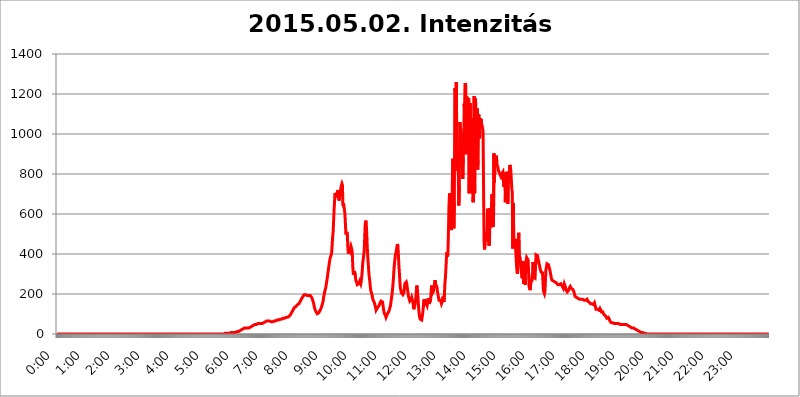
| Category | 2015.05.02. Intenzitás [W/m^2] |
|---|---|
| 0.0 | 0 |
| 0.0006944444444444445 | 0 |
| 0.001388888888888889 | 0 |
| 0.0020833333333333333 | 0 |
| 0.002777777777777778 | 0 |
| 0.003472222222222222 | 0 |
| 0.004166666666666667 | 0 |
| 0.004861111111111111 | 0 |
| 0.005555555555555556 | 0 |
| 0.0062499999999999995 | 0 |
| 0.006944444444444444 | 0 |
| 0.007638888888888889 | 0 |
| 0.008333333333333333 | 0 |
| 0.009027777777777779 | 0 |
| 0.009722222222222222 | 0 |
| 0.010416666666666666 | 0 |
| 0.011111111111111112 | 0 |
| 0.011805555555555555 | 0 |
| 0.012499999999999999 | 0 |
| 0.013194444444444444 | 0 |
| 0.013888888888888888 | 0 |
| 0.014583333333333332 | 0 |
| 0.015277777777777777 | 0 |
| 0.015972222222222224 | 0 |
| 0.016666666666666666 | 0 |
| 0.017361111111111112 | 0 |
| 0.018055555555555557 | 0 |
| 0.01875 | 0 |
| 0.019444444444444445 | 0 |
| 0.02013888888888889 | 0 |
| 0.020833333333333332 | 0 |
| 0.02152777777777778 | 0 |
| 0.022222222222222223 | 0 |
| 0.02291666666666667 | 0 |
| 0.02361111111111111 | 0 |
| 0.024305555555555556 | 0 |
| 0.024999999999999998 | 0 |
| 0.025694444444444447 | 0 |
| 0.02638888888888889 | 0 |
| 0.027083333333333334 | 0 |
| 0.027777777777777776 | 0 |
| 0.02847222222222222 | 0 |
| 0.029166666666666664 | 0 |
| 0.029861111111111113 | 0 |
| 0.030555555555555555 | 0 |
| 0.03125 | 0 |
| 0.03194444444444445 | 0 |
| 0.03263888888888889 | 0 |
| 0.03333333333333333 | 0 |
| 0.034027777777777775 | 0 |
| 0.034722222222222224 | 0 |
| 0.035416666666666666 | 0 |
| 0.036111111111111115 | 0 |
| 0.03680555555555556 | 0 |
| 0.0375 | 0 |
| 0.03819444444444444 | 0 |
| 0.03888888888888889 | 0 |
| 0.03958333333333333 | 0 |
| 0.04027777777777778 | 0 |
| 0.04097222222222222 | 0 |
| 0.041666666666666664 | 0 |
| 0.042361111111111106 | 0 |
| 0.04305555555555556 | 0 |
| 0.043750000000000004 | 0 |
| 0.044444444444444446 | 0 |
| 0.04513888888888889 | 0 |
| 0.04583333333333334 | 0 |
| 0.04652777777777778 | 0 |
| 0.04722222222222222 | 0 |
| 0.04791666666666666 | 0 |
| 0.04861111111111111 | 0 |
| 0.049305555555555554 | 0 |
| 0.049999999999999996 | 0 |
| 0.05069444444444445 | 0 |
| 0.051388888888888894 | 0 |
| 0.052083333333333336 | 0 |
| 0.05277777777777778 | 0 |
| 0.05347222222222222 | 0 |
| 0.05416666666666667 | 0 |
| 0.05486111111111111 | 0 |
| 0.05555555555555555 | 0 |
| 0.05625 | 0 |
| 0.05694444444444444 | 0 |
| 0.057638888888888885 | 0 |
| 0.05833333333333333 | 0 |
| 0.05902777777777778 | 0 |
| 0.059722222222222225 | 0 |
| 0.06041666666666667 | 0 |
| 0.061111111111111116 | 0 |
| 0.06180555555555556 | 0 |
| 0.0625 | 0 |
| 0.06319444444444444 | 0 |
| 0.06388888888888888 | 0 |
| 0.06458333333333334 | 0 |
| 0.06527777777777778 | 0 |
| 0.06597222222222222 | 0 |
| 0.06666666666666667 | 0 |
| 0.06736111111111111 | 0 |
| 0.06805555555555555 | 0 |
| 0.06874999999999999 | 0 |
| 0.06944444444444443 | 0 |
| 0.07013888888888889 | 0 |
| 0.07083333333333333 | 0 |
| 0.07152777777777779 | 0 |
| 0.07222222222222223 | 0 |
| 0.07291666666666667 | 0 |
| 0.07361111111111111 | 0 |
| 0.07430555555555556 | 0 |
| 0.075 | 0 |
| 0.07569444444444444 | 0 |
| 0.0763888888888889 | 0 |
| 0.07708333333333334 | 0 |
| 0.07777777777777778 | 0 |
| 0.07847222222222222 | 0 |
| 0.07916666666666666 | 0 |
| 0.0798611111111111 | 0 |
| 0.08055555555555556 | 0 |
| 0.08125 | 0 |
| 0.08194444444444444 | 0 |
| 0.08263888888888889 | 0 |
| 0.08333333333333333 | 0 |
| 0.08402777777777777 | 0 |
| 0.08472222222222221 | 0 |
| 0.08541666666666665 | 0 |
| 0.08611111111111112 | 0 |
| 0.08680555555555557 | 0 |
| 0.08750000000000001 | 0 |
| 0.08819444444444445 | 0 |
| 0.08888888888888889 | 0 |
| 0.08958333333333333 | 0 |
| 0.09027777777777778 | 0 |
| 0.09097222222222222 | 0 |
| 0.09166666666666667 | 0 |
| 0.09236111111111112 | 0 |
| 0.09305555555555556 | 0 |
| 0.09375 | 0 |
| 0.09444444444444444 | 0 |
| 0.09513888888888888 | 0 |
| 0.09583333333333333 | 0 |
| 0.09652777777777777 | 0 |
| 0.09722222222222222 | 0 |
| 0.09791666666666667 | 0 |
| 0.09861111111111111 | 0 |
| 0.09930555555555555 | 0 |
| 0.09999999999999999 | 0 |
| 0.10069444444444443 | 0 |
| 0.1013888888888889 | 0 |
| 0.10208333333333335 | 0 |
| 0.10277777777777779 | 0 |
| 0.10347222222222223 | 0 |
| 0.10416666666666667 | 0 |
| 0.10486111111111111 | 0 |
| 0.10555555555555556 | 0 |
| 0.10625 | 0 |
| 0.10694444444444444 | 0 |
| 0.1076388888888889 | 0 |
| 0.10833333333333334 | 0 |
| 0.10902777777777778 | 0 |
| 0.10972222222222222 | 0 |
| 0.1111111111111111 | 0 |
| 0.11180555555555556 | 0 |
| 0.11180555555555556 | 0 |
| 0.1125 | 0 |
| 0.11319444444444444 | 0 |
| 0.11388888888888889 | 0 |
| 0.11458333333333333 | 0 |
| 0.11527777777777777 | 0 |
| 0.11597222222222221 | 0 |
| 0.11666666666666665 | 0 |
| 0.1173611111111111 | 0 |
| 0.11805555555555557 | 0 |
| 0.11944444444444445 | 0 |
| 0.12013888888888889 | 0 |
| 0.12083333333333333 | 0 |
| 0.12152777777777778 | 0 |
| 0.12222222222222223 | 0 |
| 0.12291666666666667 | 0 |
| 0.12291666666666667 | 0 |
| 0.12361111111111112 | 0 |
| 0.12430555555555556 | 0 |
| 0.125 | 0 |
| 0.12569444444444444 | 0 |
| 0.12638888888888888 | 0 |
| 0.12708333333333333 | 0 |
| 0.16875 | 0 |
| 0.12847222222222224 | 0 |
| 0.12916666666666668 | 0 |
| 0.12986111111111112 | 0 |
| 0.13055555555555556 | 0 |
| 0.13125 | 0 |
| 0.13194444444444445 | 0 |
| 0.1326388888888889 | 0 |
| 0.13333333333333333 | 0 |
| 0.13402777777777777 | 0 |
| 0.13402777777777777 | 0 |
| 0.13472222222222222 | 0 |
| 0.13541666666666666 | 0 |
| 0.1361111111111111 | 0 |
| 0.13749999999999998 | 0 |
| 0.13819444444444443 | 0 |
| 0.1388888888888889 | 0 |
| 0.13958333333333334 | 0 |
| 0.14027777777777778 | 0 |
| 0.14097222222222222 | 0 |
| 0.14166666666666666 | 0 |
| 0.1423611111111111 | 0 |
| 0.14305555555555557 | 0 |
| 0.14375000000000002 | 0 |
| 0.14444444444444446 | 0 |
| 0.1451388888888889 | 0 |
| 0.1451388888888889 | 0 |
| 0.14652777777777778 | 0 |
| 0.14722222222222223 | 0 |
| 0.14791666666666667 | 0 |
| 0.1486111111111111 | 0 |
| 0.14930555555555555 | 0 |
| 0.15 | 0 |
| 0.15069444444444444 | 0 |
| 0.15138888888888888 | 0 |
| 0.15208333333333332 | 0 |
| 0.15277777777777776 | 0 |
| 0.15347222222222223 | 0 |
| 0.15416666666666667 | 0 |
| 0.15486111111111112 | 0 |
| 0.15555555555555556 | 0 |
| 0.15625 | 0 |
| 0.15694444444444444 | 0 |
| 0.15763888888888888 | 0 |
| 0.15833333333333333 | 0 |
| 0.15902777777777777 | 0 |
| 0.15972222222222224 | 0 |
| 0.16041666666666668 | 0 |
| 0.16111111111111112 | 0 |
| 0.16180555555555556 | 0 |
| 0.1625 | 0 |
| 0.16319444444444445 | 0 |
| 0.1638888888888889 | 0 |
| 0.16458333333333333 | 0 |
| 0.16527777777777777 | 0 |
| 0.16597222222222222 | 0 |
| 0.16666666666666666 | 0 |
| 0.1673611111111111 | 0 |
| 0.16805555555555554 | 0 |
| 0.16874999999999998 | 0 |
| 0.16944444444444443 | 0 |
| 0.17013888888888887 | 0 |
| 0.1708333333333333 | 0 |
| 0.17152777777777775 | 0 |
| 0.17222222222222225 | 0 |
| 0.1729166666666667 | 0 |
| 0.17361111111111113 | 0 |
| 0.17430555555555557 | 0 |
| 0.17500000000000002 | 0 |
| 0.17569444444444446 | 0 |
| 0.1763888888888889 | 0 |
| 0.17708333333333334 | 0 |
| 0.17777777777777778 | 0 |
| 0.17847222222222223 | 0 |
| 0.17916666666666667 | 0 |
| 0.1798611111111111 | 0 |
| 0.18055555555555555 | 0 |
| 0.18125 | 0 |
| 0.18194444444444444 | 0 |
| 0.1826388888888889 | 0 |
| 0.18333333333333335 | 0 |
| 0.1840277777777778 | 0 |
| 0.18472222222222223 | 0 |
| 0.18541666666666667 | 0 |
| 0.18611111111111112 | 0 |
| 0.18680555555555556 | 0 |
| 0.1875 | 0 |
| 0.18819444444444444 | 0 |
| 0.18888888888888888 | 0 |
| 0.18958333333333333 | 0 |
| 0.19027777777777777 | 0 |
| 0.1909722222222222 | 0 |
| 0.19166666666666665 | 0 |
| 0.19236111111111112 | 0 |
| 0.19305555555555554 | 0 |
| 0.19375 | 0 |
| 0.19444444444444445 | 0 |
| 0.1951388888888889 | 0 |
| 0.19583333333333333 | 0 |
| 0.19652777777777777 | 0 |
| 0.19722222222222222 | 0 |
| 0.19791666666666666 | 0 |
| 0.1986111111111111 | 0 |
| 0.19930555555555554 | 0 |
| 0.19999999999999998 | 0 |
| 0.20069444444444443 | 0 |
| 0.20138888888888887 | 0 |
| 0.2020833333333333 | 0 |
| 0.2027777777777778 | 0 |
| 0.2034722222222222 | 0 |
| 0.2041666666666667 | 0 |
| 0.20486111111111113 | 0 |
| 0.20555555555555557 | 0 |
| 0.20625000000000002 | 0 |
| 0.20694444444444446 | 0 |
| 0.2076388888888889 | 0 |
| 0.20833333333333334 | 0 |
| 0.20902777777777778 | 0 |
| 0.20972222222222223 | 0 |
| 0.21041666666666667 | 0 |
| 0.2111111111111111 | 0 |
| 0.21180555555555555 | 0 |
| 0.2125 | 0 |
| 0.21319444444444444 | 0 |
| 0.2138888888888889 | 0 |
| 0.21458333333333335 | 0 |
| 0.2152777777777778 | 0 |
| 0.21597222222222223 | 0 |
| 0.21666666666666667 | 0 |
| 0.21736111111111112 | 0 |
| 0.21805555555555556 | 0 |
| 0.21875 | 0 |
| 0.21944444444444444 | 0 |
| 0.22013888888888888 | 0 |
| 0.22083333333333333 | 0 |
| 0.22152777777777777 | 0 |
| 0.2222222222222222 | 0 |
| 0.22291666666666665 | 0 |
| 0.2236111111111111 | 0 |
| 0.22430555555555556 | 0 |
| 0.225 | 0 |
| 0.22569444444444445 | 0 |
| 0.2263888888888889 | 0 |
| 0.22708333333333333 | 0 |
| 0.22777777777777777 | 0 |
| 0.22847222222222222 | 0 |
| 0.22916666666666666 | 0 |
| 0.2298611111111111 | 0 |
| 0.23055555555555554 | 0 |
| 0.23124999999999998 | 0 |
| 0.23194444444444443 | 0 |
| 0.23263888888888887 | 0 |
| 0.2333333333333333 | 0 |
| 0.2340277777777778 | 0 |
| 0.2347222222222222 | 0 |
| 0.2354166666666667 | 3.525 |
| 0.23611111111111113 | 0 |
| 0.23680555555555557 | 3.525 |
| 0.23750000000000002 | 3.525 |
| 0.23819444444444446 | 3.525 |
| 0.2388888888888889 | 3.525 |
| 0.23958333333333334 | 3.525 |
| 0.24027777777777778 | 3.525 |
| 0.24097222222222223 | 3.525 |
| 0.24166666666666667 | 3.525 |
| 0.2423611111111111 | 3.525 |
| 0.24305555555555555 | 3.525 |
| 0.24375 | 7.887 |
| 0.24444444444444446 | 7.887 |
| 0.24513888888888888 | 7.887 |
| 0.24583333333333335 | 7.887 |
| 0.2465277777777778 | 3.525 |
| 0.24722222222222223 | 7.887 |
| 0.24791666666666667 | 7.887 |
| 0.24861111111111112 | 7.887 |
| 0.24930555555555556 | 7.887 |
| 0.25 | 7.887 |
| 0.25069444444444444 | 7.887 |
| 0.2513888888888889 | 12.257 |
| 0.2520833333333333 | 12.257 |
| 0.25277777777777777 | 12.257 |
| 0.2534722222222222 | 12.257 |
| 0.25416666666666665 | 12.257 |
| 0.2548611111111111 | 12.257 |
| 0.2555555555555556 | 16.636 |
| 0.25625000000000003 | 16.636 |
| 0.2569444444444445 | 16.636 |
| 0.2576388888888889 | 21.024 |
| 0.25833333333333336 | 21.024 |
| 0.2590277777777778 | 21.024 |
| 0.25972222222222224 | 25.419 |
| 0.2604166666666667 | 25.419 |
| 0.2611111111111111 | 25.419 |
| 0.26180555555555557 | 29.823 |
| 0.2625 | 29.823 |
| 0.26319444444444445 | 29.823 |
| 0.2638888888888889 | 29.823 |
| 0.26458333333333334 | 29.823 |
| 0.2652777777777778 | 29.823 |
| 0.2659722222222222 | 29.823 |
| 0.26666666666666666 | 29.823 |
| 0.2673611111111111 | 29.823 |
| 0.26805555555555555 | 29.823 |
| 0.26875 | 29.823 |
| 0.26944444444444443 | 29.823 |
| 0.2701388888888889 | 29.823 |
| 0.2708333333333333 | 34.234 |
| 0.27152777777777776 | 34.234 |
| 0.2722222222222222 | 38.653 |
| 0.27291666666666664 | 38.653 |
| 0.2736111111111111 | 43.079 |
| 0.2743055555555555 | 43.079 |
| 0.27499999999999997 | 43.079 |
| 0.27569444444444446 | 47.511 |
| 0.27638888888888885 | 47.511 |
| 0.27708333333333335 | 47.511 |
| 0.2777777777777778 | 47.511 |
| 0.27847222222222223 | 47.511 |
| 0.2791666666666667 | 47.511 |
| 0.2798611111111111 | 47.511 |
| 0.28055555555555556 | 51.951 |
| 0.28125 | 51.951 |
| 0.28194444444444444 | 51.951 |
| 0.2826388888888889 | 51.951 |
| 0.2833333333333333 | 51.951 |
| 0.28402777777777777 | 51.951 |
| 0.2847222222222222 | 51.951 |
| 0.28541666666666665 | 51.951 |
| 0.28611111111111115 | 51.951 |
| 0.28680555555555554 | 51.951 |
| 0.28750000000000003 | 51.951 |
| 0.2881944444444445 | 56.398 |
| 0.2888888888888889 | 56.398 |
| 0.28958333333333336 | 56.398 |
| 0.2902777777777778 | 60.85 |
| 0.29097222222222224 | 60.85 |
| 0.2916666666666667 | 60.85 |
| 0.2923611111111111 | 65.31 |
| 0.29305555555555557 | 65.31 |
| 0.29375 | 65.31 |
| 0.29444444444444445 | 65.31 |
| 0.2951388888888889 | 65.31 |
| 0.29583333333333334 | 65.31 |
| 0.2965277777777778 | 65.31 |
| 0.2972222222222222 | 65.31 |
| 0.29791666666666666 | 65.31 |
| 0.2986111111111111 | 65.31 |
| 0.29930555555555555 | 65.31 |
| 0.3 | 60.85 |
| 0.30069444444444443 | 60.85 |
| 0.3013888888888889 | 60.85 |
| 0.3020833333333333 | 60.85 |
| 0.30277777777777776 | 60.85 |
| 0.3034722222222222 | 65.31 |
| 0.30416666666666664 | 65.31 |
| 0.3048611111111111 | 65.31 |
| 0.3055555555555555 | 65.31 |
| 0.30624999999999997 | 65.31 |
| 0.3069444444444444 | 69.775 |
| 0.3076388888888889 | 69.775 |
| 0.30833333333333335 | 69.775 |
| 0.3090277777777778 | 69.775 |
| 0.30972222222222223 | 69.775 |
| 0.3104166666666667 | 69.775 |
| 0.3111111111111111 | 69.775 |
| 0.31180555555555556 | 69.775 |
| 0.3125 | 74.246 |
| 0.31319444444444444 | 74.246 |
| 0.3138888888888889 | 74.246 |
| 0.3145833333333333 | 74.246 |
| 0.31527777777777777 | 74.246 |
| 0.3159722222222222 | 74.246 |
| 0.31666666666666665 | 78.722 |
| 0.31736111111111115 | 78.722 |
| 0.31805555555555554 | 78.722 |
| 0.31875000000000003 | 78.722 |
| 0.3194444444444445 | 83.205 |
| 0.3201388888888889 | 83.205 |
| 0.32083333333333336 | 83.205 |
| 0.3215277777777778 | 83.205 |
| 0.32222222222222224 | 83.205 |
| 0.3229166666666667 | 83.205 |
| 0.3236111111111111 | 83.205 |
| 0.32430555555555557 | 83.205 |
| 0.325 | 87.692 |
| 0.32569444444444445 | 87.692 |
| 0.3263888888888889 | 92.184 |
| 0.32708333333333334 | 96.682 |
| 0.3277777777777778 | 101.184 |
| 0.3284722222222222 | 105.69 |
| 0.32916666666666666 | 110.201 |
| 0.3298611111111111 | 114.716 |
| 0.33055555555555555 | 119.235 |
| 0.33125 | 123.758 |
| 0.33194444444444443 | 128.284 |
| 0.3326388888888889 | 132.814 |
| 0.3333333333333333 | 132.814 |
| 0.3340277777777778 | 137.347 |
| 0.3347222222222222 | 137.347 |
| 0.3354166666666667 | 141.884 |
| 0.3361111111111111 | 141.884 |
| 0.3368055555555556 | 146.423 |
| 0.33749999999999997 | 146.423 |
| 0.33819444444444446 | 150.964 |
| 0.33888888888888885 | 150.964 |
| 0.33958333333333335 | 155.509 |
| 0.34027777777777773 | 160.056 |
| 0.34097222222222223 | 164.605 |
| 0.3416666666666666 | 169.156 |
| 0.3423611111111111 | 173.709 |
| 0.3430555555555555 | 178.264 |
| 0.34375 | 182.82 |
| 0.3444444444444445 | 187.378 |
| 0.3451388888888889 | 191.937 |
| 0.3458333333333334 | 191.937 |
| 0.34652777777777777 | 196.497 |
| 0.34722222222222227 | 196.497 |
| 0.34791666666666665 | 191.937 |
| 0.34861111111111115 | 196.497 |
| 0.34930555555555554 | 196.497 |
| 0.35000000000000003 | 196.497 |
| 0.3506944444444444 | 191.937 |
| 0.3513888888888889 | 191.937 |
| 0.3520833333333333 | 191.937 |
| 0.3527777777777778 | 191.937 |
| 0.3534722222222222 | 191.937 |
| 0.3541666666666667 | 191.937 |
| 0.3548611111111111 | 191.937 |
| 0.35555555555555557 | 191.937 |
| 0.35625 | 191.937 |
| 0.35694444444444445 | 182.82 |
| 0.3576388888888889 | 178.264 |
| 0.35833333333333334 | 169.156 |
| 0.3590277777777778 | 160.056 |
| 0.3597222222222222 | 150.964 |
| 0.36041666666666666 | 137.347 |
| 0.3611111111111111 | 128.284 |
| 0.36180555555555555 | 119.235 |
| 0.3625 | 114.716 |
| 0.36319444444444443 | 110.201 |
| 0.3638888888888889 | 105.69 |
| 0.3645833333333333 | 101.184 |
| 0.3652777777777778 | 101.184 |
| 0.3659722222222222 | 105.69 |
| 0.3666666666666667 | 105.69 |
| 0.3673611111111111 | 110.201 |
| 0.3680555555555556 | 114.716 |
| 0.36874999999999997 | 119.235 |
| 0.36944444444444446 | 123.758 |
| 0.37013888888888885 | 128.284 |
| 0.37083333333333335 | 137.347 |
| 0.37152777777777773 | 146.423 |
| 0.37222222222222223 | 155.509 |
| 0.3729166666666666 | 164.605 |
| 0.3736111111111111 | 182.82 |
| 0.3743055555555555 | 196.497 |
| 0.375 | 210.182 |
| 0.3756944444444445 | 219.309 |
| 0.3763888888888889 | 228.436 |
| 0.3770833333333334 | 242.127 |
| 0.37777777777777777 | 260.373 |
| 0.37847222222222227 | 274.047 |
| 0.37916666666666665 | 292.259 |
| 0.37986111111111115 | 310.44 |
| 0.38055555555555554 | 328.584 |
| 0.38125000000000003 | 346.682 |
| 0.3819444444444444 | 364.728 |
| 0.3826388888888889 | 378.224 |
| 0.3833333333333333 | 387.202 |
| 0.3840277777777778 | 387.202 |
| 0.3847222222222222 | 400.638 |
| 0.3854166666666667 | 436.27 |
| 0.3861111111111111 | 480.356 |
| 0.38680555555555557 | 502.192 |
| 0.3875 | 553.986 |
| 0.38819444444444445 | 617.436 |
| 0.3888888888888889 | 658.909 |
| 0.38958333333333334 | 703.762 |
| 0.3902777777777778 | 707.8 |
| 0.3909722222222222 | 683.473 |
| 0.39166666666666666 | 683.473 |
| 0.3923611111111111 | 687.544 |
| 0.39305555555555555 | 711.832 |
| 0.39375 | 719.877 |
| 0.39444444444444443 | 687.544 |
| 0.3951388888888889 | 667.123 |
| 0.3958333333333333 | 679.395 |
| 0.3965277777777778 | 703.762 |
| 0.3972222222222222 | 715.858 |
| 0.3979166666666667 | 731.896 |
| 0.3986111111111111 | 743.859 |
| 0.3993055555555556 | 751.803 |
| 0.39999999999999997 | 743.859 |
| 0.40069444444444446 | 642.4 |
| 0.40138888888888885 | 654.791 |
| 0.40208333333333335 | 634.105 |
| 0.40277777777777773 | 621.613 |
| 0.40347222222222223 | 600.661 |
| 0.4041666666666666 | 549.704 |
| 0.4048611111111111 | 497.836 |
| 0.4055555555555555 | 497.836 |
| 0.40625 | 510.885 |
| 0.4069444444444445 | 489.108 |
| 0.4076388888888889 | 431.833 |
| 0.4083333333333334 | 400.638 |
| 0.40902777777777777 | 422.943 |
| 0.40972222222222227 | 418.492 |
| 0.41041666666666665 | 414.035 |
| 0.41111111111111115 | 431.833 |
| 0.41180555555555554 | 440.702 |
| 0.41250000000000003 | 431.833 |
| 0.4131944444444444 | 422.943 |
| 0.4138888888888889 | 396.164 |
| 0.4145833333333333 | 333.113 |
| 0.4152777777777778 | 296.808 |
| 0.4159722222222222 | 305.898 |
| 0.4166666666666667 | 314.98 |
| 0.4173611111111111 | 314.98 |
| 0.41805555555555557 | 292.259 |
| 0.41875 | 269.49 |
| 0.41944444444444445 | 264.932 |
| 0.4201388888888889 | 255.813 |
| 0.42083333333333334 | 246.689 |
| 0.4215277777777778 | 246.689 |
| 0.4222222222222222 | 246.689 |
| 0.42291666666666666 | 251.251 |
| 0.4236111111111111 | 246.689 |
| 0.42430555555555555 | 264.932 |
| 0.425 | 260.373 |
| 0.42569444444444443 | 251.251 |
| 0.4263888888888889 | 264.932 |
| 0.4270833333333333 | 287.709 |
| 0.4277777777777778 | 314.98 |
| 0.4284722222222222 | 355.712 |
| 0.4291666666666667 | 373.729 |
| 0.4298611111111111 | 378.224 |
| 0.4305555555555556 | 418.492 |
| 0.43124999999999997 | 484.735 |
| 0.43194444444444446 | 549.704 |
| 0.43263888888888885 | 566.793 |
| 0.43333333333333335 | 553.986 |
| 0.43402777777777773 | 506.542 |
| 0.43472222222222223 | 440.702 |
| 0.4354166666666666 | 391.685 |
| 0.4361111111111111 | 355.712 |
| 0.4368055555555555 | 319.517 |
| 0.4375 | 287.709 |
| 0.4381944444444445 | 269.49 |
| 0.4388888888888889 | 242.127 |
| 0.4395833333333334 | 219.309 |
| 0.44027777777777777 | 210.182 |
| 0.44097222222222227 | 210.182 |
| 0.44166666666666665 | 191.937 |
| 0.44236111111111115 | 178.264 |
| 0.44305555555555554 | 169.156 |
| 0.44375000000000003 | 164.605 |
| 0.4444444444444444 | 160.056 |
| 0.4451388888888889 | 150.964 |
| 0.4458333333333333 | 141.884 |
| 0.4465277777777778 | 132.814 |
| 0.4472222222222222 | 119.235 |
| 0.4479166666666667 | 114.716 |
| 0.4486111111111111 | 123.758 |
| 0.44930555555555557 | 132.814 |
| 0.45 | 132.814 |
| 0.45069444444444445 | 137.347 |
| 0.4513888888888889 | 141.884 |
| 0.45208333333333334 | 146.423 |
| 0.4527777777777778 | 155.509 |
| 0.4534722222222222 | 160.056 |
| 0.45416666666666666 | 164.605 |
| 0.4548611111111111 | 164.605 |
| 0.45555555555555555 | 169.156 |
| 0.45625 | 160.056 |
| 0.45694444444444443 | 141.884 |
| 0.4576388888888889 | 123.758 |
| 0.4583333333333333 | 110.201 |
| 0.4590277777777778 | 101.184 |
| 0.4597222222222222 | 96.682 |
| 0.4604166666666667 | 92.184 |
| 0.4611111111111111 | 83.205 |
| 0.4618055555555556 | 83.205 |
| 0.46249999999999997 | 87.692 |
| 0.46319444444444446 | 101.184 |
| 0.46388888888888885 | 105.69 |
| 0.46458333333333335 | 105.69 |
| 0.46527777777777773 | 114.716 |
| 0.46597222222222223 | 123.758 |
| 0.4666666666666666 | 128.284 |
| 0.4673611111111111 | 141.884 |
| 0.4680555555555555 | 160.056 |
| 0.46875 | 178.264 |
| 0.4694444444444445 | 196.497 |
| 0.4701388888888889 | 219.309 |
| 0.4708333333333334 | 246.689 |
| 0.47152777777777777 | 278.603 |
| 0.47222222222222227 | 319.517 |
| 0.47291666666666665 | 351.198 |
| 0.47361111111111115 | 373.729 |
| 0.47430555555555554 | 396.164 |
| 0.47500000000000003 | 405.108 |
| 0.4756944444444444 | 418.492 |
| 0.4763888888888889 | 436.27 |
| 0.4770833333333333 | 449.551 |
| 0.4777777777777778 | 440.702 |
| 0.4784722222222222 | 396.164 |
| 0.4791666666666667 | 342.162 |
| 0.4798611111111111 | 305.898 |
| 0.48055555555555557 | 260.373 |
| 0.48125 | 228.436 |
| 0.48194444444444445 | 219.309 |
| 0.4826388888888889 | 205.62 |
| 0.48333333333333334 | 210.182 |
| 0.4840277777777778 | 205.62 |
| 0.4847222222222222 | 196.497 |
| 0.48541666666666666 | 201.058 |
| 0.4861111111111111 | 205.62 |
| 0.48680555555555555 | 223.873 |
| 0.4875 | 251.251 |
| 0.48819444444444443 | 251.251 |
| 0.4888888888888889 | 251.251 |
| 0.4895833333333333 | 260.373 |
| 0.4902777777777778 | 251.251 |
| 0.4909722222222222 | 228.436 |
| 0.4916666666666667 | 214.746 |
| 0.4923611111111111 | 191.937 |
| 0.4930555555555556 | 182.82 |
| 0.49374999999999997 | 173.709 |
| 0.49444444444444446 | 164.605 |
| 0.49513888888888885 | 160.056 |
| 0.49583333333333335 | 160.056 |
| 0.49652777777777773 | 173.709 |
| 0.49722222222222223 | 182.82 |
| 0.4979166666666666 | 173.709 |
| 0.4986111111111111 | 160.056 |
| 0.4993055555555555 | 146.423 |
| 0.5 | 123.758 |
| 0.5006944444444444 | 119.235 |
| 0.5013888888888889 | 128.284 |
| 0.5020833333333333 | 155.509 |
| 0.5027777777777778 | 173.709 |
| 0.5034722222222222 | 205.62 |
| 0.5041666666666667 | 242.127 |
| 0.5048611111111111 | 233 |
| 0.5055555555555555 | 201.058 |
| 0.50625 | 164.605 |
| 0.5069444444444444 | 123.758 |
| 0.5076388888888889 | 101.184 |
| 0.5083333333333333 | 83.205 |
| 0.5090277777777777 | 74.246 |
| 0.5097222222222222 | 74.246 |
| 0.5104166666666666 | 69.775 |
| 0.5111111111111112 | 69.775 |
| 0.5118055555555555 | 74.246 |
| 0.5125000000000001 | 101.184 |
| 0.5131944444444444 | 128.284 |
| 0.513888888888889 | 160.056 |
| 0.5145833333333333 | 173.709 |
| 0.5152777777777778 | 150.964 |
| 0.5159722222222222 | 150.964 |
| 0.5166666666666667 | 160.056 |
| 0.517361111111111 | 155.509 |
| 0.5180555555555556 | 155.509 |
| 0.5187499999999999 | 141.884 |
| 0.5194444444444445 | 155.509 |
| 0.5201388888888888 | 178.264 |
| 0.5208333333333334 | 169.156 |
| 0.5215277777777778 | 150.964 |
| 0.5222222222222223 | 150.964 |
| 0.5229166666666667 | 155.509 |
| 0.5236111111111111 | 169.156 |
| 0.5243055555555556 | 205.62 |
| 0.525 | 242.127 |
| 0.5256944444444445 | 228.436 |
| 0.5263888888888889 | 205.62 |
| 0.5270833333333333 | 205.62 |
| 0.5277777777777778 | 214.746 |
| 0.5284722222222222 | 228.436 |
| 0.5291666666666667 | 251.251 |
| 0.5298611111111111 | 269.49 |
| 0.5305555555555556 | 251.251 |
| 0.53125 | 251.251 |
| 0.5319444444444444 | 246.689 |
| 0.5326388888888889 | 233 |
| 0.5333333333333333 | 210.182 |
| 0.5340277777777778 | 196.497 |
| 0.5347222222222222 | 182.82 |
| 0.5354166666666667 | 169.156 |
| 0.5361111111111111 | 169.156 |
| 0.5368055555555555 | 173.709 |
| 0.5375 | 169.156 |
| 0.5381944444444444 | 160.056 |
| 0.5388888888888889 | 150.964 |
| 0.5395833333333333 | 155.509 |
| 0.5402777777777777 | 164.605 |
| 0.5409722222222222 | 187.378 |
| 0.5416666666666666 | 169.156 |
| 0.5423611111111112 | 160.056 |
| 0.5430555555555555 | 201.058 |
| 0.5437500000000001 | 255.813 |
| 0.5444444444444444 | 283.156 |
| 0.545138888888889 | 328.584 |
| 0.5458333333333333 | 378.224 |
| 0.5465277777777778 | 409.574 |
| 0.5472222222222222 | 387.202 |
| 0.5479166666666667 | 400.638 |
| 0.548611111111111 | 502.192 |
| 0.5493055555555556 | 629.948 |
| 0.5499999999999999 | 691.608 |
| 0.5506944444444445 | 703.762 |
| 0.5513888888888888 | 617.436 |
| 0.5520833333333334 | 566.793 |
| 0.5527777777777778 | 519.555 |
| 0.5534722222222223 | 549.704 |
| 0.5541666666666667 | 767.62 |
| 0.5548611111111111 | 875.918 |
| 0.5555555555555556 | 638.256 |
| 0.55625 | 528.2 |
| 0.5569444444444445 | 658.909 |
| 0.5576388888888889 | 1229.899 |
| 0.5583333333333333 | 1217.812 |
| 0.5590277777777778 | 849.199 |
| 0.5597222222222222 | 1258.511 |
| 0.5604166666666667 | 906.223 |
| 0.5611111111111111 | 818.392 |
| 0.5618055555555556 | 837.682 |
| 0.5625 | 810.641 |
| 0.5631944444444444 | 642.4 |
| 0.5638888888888889 | 739.877 |
| 0.5645833333333333 | 1059.756 |
| 0.5652777777777778 | 1041.019 |
| 0.5659722222222222 | 1026.06 |
| 0.5666666666666667 | 1007.383 |
| 0.5673611111111111 | 955.071 |
| 0.5680555555555555 | 917.534 |
| 0.56875 | 775.492 |
| 0.5694444444444444 | 879.719 |
| 0.5701388888888889 | 940.082 |
| 0.5708333333333333 | 1150.946 |
| 0.5715277777777777 | 1093.653 |
| 0.5722222222222222 | 1254.387 |
| 0.5729166666666666 | 1242.089 |
| 0.5736111111111112 | 898.668 |
| 0.5743055555555555 | 1186.03 |
| 0.5750000000000001 | 1186.03 |
| 0.5756944444444444 | 1186.03 |
| 0.576388888888889 | 1162.571 |
| 0.5770833333333333 | 1178.177 |
| 0.5777777777777778 | 703.762 |
| 0.5784722222222222 | 906.223 |
| 0.5791666666666667 | 1154.814 |
| 0.579861111111111 | 759.723 |
| 0.5805555555555556 | 1078.555 |
| 0.5812499999999999 | 703.762 |
| 0.5819444444444445 | 711.832 |
| 0.5826388888888888 | 999.916 |
| 0.5833333333333334 | 658.909 |
| 0.5840277777777778 | 715.858 |
| 0.5847222222222223 | 1189.969 |
| 0.5854166666666667 | 703.762 |
| 0.5861111111111111 | 1178.177 |
| 0.5868055555555556 | 1158.689 |
| 0.5875 | 1086.097 |
| 0.5881944444444445 | 1059.756 |
| 0.5888888888888889 | 1127.879 |
| 0.5895833333333333 | 822.26 |
| 0.5902777777777778 | 868.305 |
| 0.5909722222222222 | 1097.437 |
| 0.5916666666666667 | 1089.873 |
| 0.5923611111111111 | 977.508 |
| 0.5930555555555556 | 1078.555 |
| 0.59375 | 1056.004 |
| 0.5944444444444444 | 1074.789 |
| 0.5951388888888889 | 1052.255 |
| 0.5958333333333333 | 1052.255 |
| 0.5965277777777778 | 1029.798 |
| 0.5972222222222222 | 1014.852 |
| 0.5979166666666667 | 1018.587 |
| 0.5986111111111111 | 462.786 |
| 0.5993055555555555 | 422.943 |
| 0.6 | 458.38 |
| 0.6006944444444444 | 462.786 |
| 0.6013888888888889 | 484.735 |
| 0.6020833333333333 | 502.192 |
| 0.6027777777777777 | 519.555 |
| 0.6034722222222222 | 625.784 |
| 0.6041666666666666 | 506.542 |
| 0.6048611111111112 | 462.786 |
| 0.6055555555555555 | 440.702 |
| 0.6062500000000001 | 453.968 |
| 0.6069444444444444 | 629.948 |
| 0.607638888888889 | 549.704 |
| 0.6083333333333333 | 532.513 |
| 0.6090277777777778 | 642.4 |
| 0.6097222222222222 | 699.717 |
| 0.6104166666666667 | 617.436 |
| 0.611111111111111 | 583.779 |
| 0.6118055555555556 | 536.82 |
| 0.6124999999999999 | 902.447 |
| 0.6131944444444445 | 755.766 |
| 0.6138888888888888 | 872.114 |
| 0.6145833333333334 | 868.305 |
| 0.6152777777777778 | 845.365 |
| 0.6159722222222223 | 891.099 |
| 0.6166666666666667 | 845.365 |
| 0.6173611111111111 | 849.199 |
| 0.6180555555555556 | 833.834 |
| 0.61875 | 818.392 |
| 0.6194444444444445 | 810.641 |
| 0.6201388888888889 | 810.641 |
| 0.6208333333333333 | 798.974 |
| 0.6215277777777778 | 802.868 |
| 0.6222222222222222 | 787.258 |
| 0.6229166666666667 | 795.074 |
| 0.6236111111111111 | 802.868 |
| 0.6243055555555556 | 806.757 |
| 0.625 | 810.641 |
| 0.6256944444444444 | 806.757 |
| 0.6263888888888889 | 735.89 |
| 0.6270833333333333 | 802.868 |
| 0.6277777777777778 | 791.169 |
| 0.6284722222222222 | 658.909 |
| 0.6291666666666667 | 810.641 |
| 0.6298611111111111 | 810.641 |
| 0.6305555555555555 | 798.974 |
| 0.63125 | 783.342 |
| 0.6319444444444444 | 650.667 |
| 0.6326388888888889 | 810.641 |
| 0.6333333333333333 | 791.169 |
| 0.6340277777777777 | 759.723 |
| 0.6347222222222222 | 845.365 |
| 0.6354166666666666 | 837.682 |
| 0.6361111111111112 | 818.392 |
| 0.6368055555555555 | 775.492 |
| 0.6375000000000001 | 727.896 |
| 0.6381944444444444 | 707.8 |
| 0.638888888888889 | 427.39 |
| 0.6395833333333333 | 654.791 |
| 0.6402777777777778 | 471.582 |
| 0.6409722222222222 | 445.129 |
| 0.6416666666666667 | 467.187 |
| 0.642361111111111 | 475.972 |
| 0.6430555555555556 | 418.492 |
| 0.6437499999999999 | 369.23 |
| 0.6444444444444445 | 328.584 |
| 0.6451388888888888 | 301.354 |
| 0.6458333333333334 | 310.44 |
| 0.6465277777777778 | 351.198 |
| 0.6472222222222223 | 506.542 |
| 0.6479166666666667 | 396.164 |
| 0.6486111111111111 | 396.164 |
| 0.6493055555555556 | 378.224 |
| 0.65 | 346.682 |
| 0.6506944444444445 | 324.052 |
| 0.6513888888888889 | 296.808 |
| 0.6520833333333333 | 278.603 |
| 0.6527777777777778 | 364.728 |
| 0.6534722222222222 | 305.898 |
| 0.6541666666666667 | 251.251 |
| 0.6548611111111111 | 360.221 |
| 0.6555555555555556 | 351.198 |
| 0.65625 | 246.689 |
| 0.6569444444444444 | 351.198 |
| 0.6576388888888889 | 369.23 |
| 0.6583333333333333 | 382.715 |
| 0.6590277777777778 | 382.715 |
| 0.6597222222222222 | 378.224 |
| 0.6604166666666667 | 369.23 |
| 0.6611111111111111 | 373.729 |
| 0.6618055555555555 | 237.564 |
| 0.6625 | 233 |
| 0.6631944444444444 | 219.309 |
| 0.6638888888888889 | 219.309 |
| 0.6645833333333333 | 274.047 |
| 0.6652777777777777 | 260.373 |
| 0.6659722222222222 | 260.373 |
| 0.6666666666666666 | 301.354 |
| 0.6673611111111111 | 360.221 |
| 0.6680555555555556 | 283.156 |
| 0.6687500000000001 | 283.156 |
| 0.6694444444444444 | 287.709 |
| 0.6701388888888888 | 278.603 |
| 0.6708333333333334 | 283.156 |
| 0.6715277777777778 | 396.164 |
| 0.6722222222222222 | 396.164 |
| 0.6729166666666666 | 400.638 |
| 0.6736111111111112 | 391.685 |
| 0.6743055555555556 | 378.224 |
| 0.6749999999999999 | 364.728 |
| 0.6756944444444444 | 360.221 |
| 0.6763888888888889 | 342.162 |
| 0.6770833333333334 | 328.584 |
| 0.6777777777777777 | 319.517 |
| 0.6784722222222223 | 310.44 |
| 0.6791666666666667 | 305.898 |
| 0.6798611111111111 | 305.898 |
| 0.6805555555555555 | 305.898 |
| 0.68125 | 305.898 |
| 0.6819444444444445 | 214.746 |
| 0.6826388888888889 | 219.309 |
| 0.6833333333333332 | 201.058 |
| 0.6840277777777778 | 214.746 |
| 0.6847222222222222 | 214.746 |
| 0.6854166666666667 | 324.052 |
| 0.686111111111111 | 333.113 |
| 0.6868055555555556 | 351.198 |
| 0.6875 | 355.712 |
| 0.6881944444444444 | 351.198 |
| 0.688888888888889 | 346.682 |
| 0.6895833333333333 | 337.639 |
| 0.6902777777777778 | 328.584 |
| 0.6909722222222222 | 319.517 |
| 0.6916666666666668 | 305.898 |
| 0.6923611111111111 | 292.259 |
| 0.6930555555555555 | 278.603 |
| 0.69375 | 269.49 |
| 0.6944444444444445 | 269.49 |
| 0.6951388888888889 | 264.932 |
| 0.6958333333333333 | 264.932 |
| 0.6965277777777777 | 260.373 |
| 0.6972222222222223 | 260.373 |
| 0.6979166666666666 | 260.373 |
| 0.6986111111111111 | 260.373 |
| 0.6993055555555556 | 260.373 |
| 0.7000000000000001 | 255.813 |
| 0.7006944444444444 | 255.813 |
| 0.7013888888888888 | 251.251 |
| 0.7020833333333334 | 246.689 |
| 0.7027777777777778 | 251.251 |
| 0.7034722222222222 | 246.689 |
| 0.7041666666666666 | 246.689 |
| 0.7048611111111112 | 246.689 |
| 0.7055555555555556 | 251.251 |
| 0.7062499999999999 | 251.251 |
| 0.7069444444444444 | 251.251 |
| 0.7076388888888889 | 246.689 |
| 0.7083333333333334 | 237.564 |
| 0.7090277777777777 | 233 |
| 0.7097222222222223 | 228.436 |
| 0.7104166666666667 | 233 |
| 0.7111111111111111 | 251.251 |
| 0.7118055555555555 | 255.813 |
| 0.7125 | 237.564 |
| 0.7131944444444445 | 228.436 |
| 0.7138888888888889 | 219.309 |
| 0.7145833333333332 | 214.746 |
| 0.7152777777777778 | 210.182 |
| 0.7159722222222222 | 210.182 |
| 0.7166666666666667 | 214.746 |
| 0.717361111111111 | 219.309 |
| 0.7180555555555556 | 228.436 |
| 0.71875 | 233 |
| 0.7194444444444444 | 237.564 |
| 0.720138888888889 | 233 |
| 0.7208333333333333 | 228.436 |
| 0.7215277777777778 | 223.873 |
| 0.7222222222222222 | 228.436 |
| 0.7229166666666668 | 223.873 |
| 0.7236111111111111 | 223.873 |
| 0.7243055555555555 | 214.746 |
| 0.725 | 205.62 |
| 0.7256944444444445 | 196.497 |
| 0.7263888888888889 | 187.378 |
| 0.7270833333333333 | 182.82 |
| 0.7277777777777777 | 182.82 |
| 0.7284722222222223 | 182.82 |
| 0.7291666666666666 | 182.82 |
| 0.7298611111111111 | 182.82 |
| 0.7305555555555556 | 178.264 |
| 0.7312500000000001 | 178.264 |
| 0.7319444444444444 | 178.264 |
| 0.7326388888888888 | 173.709 |
| 0.7333333333333334 | 173.709 |
| 0.7340277777777778 | 173.709 |
| 0.7347222222222222 | 173.709 |
| 0.7354166666666666 | 173.709 |
| 0.7361111111111112 | 173.709 |
| 0.7368055555555556 | 173.709 |
| 0.7374999999999999 | 173.709 |
| 0.7381944444444444 | 169.156 |
| 0.7388888888888889 | 169.156 |
| 0.7395833333333334 | 169.156 |
| 0.7402777777777777 | 169.156 |
| 0.7409722222222223 | 169.156 |
| 0.7416666666666667 | 169.156 |
| 0.7423611111111111 | 169.156 |
| 0.7430555555555555 | 173.709 |
| 0.74375 | 164.605 |
| 0.7444444444444445 | 164.605 |
| 0.7451388888888889 | 160.056 |
| 0.7458333333333332 | 160.056 |
| 0.7465277777777778 | 160.056 |
| 0.7472222222222222 | 164.605 |
| 0.7479166666666667 | 150.964 |
| 0.748611111111111 | 150.964 |
| 0.7493055555555556 | 146.423 |
| 0.75 | 150.964 |
| 0.7506944444444444 | 146.423 |
| 0.751388888888889 | 146.423 |
| 0.7520833333333333 | 146.423 |
| 0.7527777777777778 | 150.964 |
| 0.7534722222222222 | 155.509 |
| 0.7541666666666668 | 146.423 |
| 0.7548611111111111 | 141.884 |
| 0.7555555555555555 | 123.758 |
| 0.75625 | 119.235 |
| 0.7569444444444445 | 128.284 |
| 0.7576388888888889 | 123.758 |
| 0.7583333333333333 | 119.235 |
| 0.7590277777777777 | 119.235 |
| 0.7597222222222223 | 119.235 |
| 0.7604166666666666 | 119.235 |
| 0.7611111111111111 | 128.284 |
| 0.7618055555555556 | 128.284 |
| 0.7625000000000001 | 119.235 |
| 0.7631944444444444 | 110.201 |
| 0.7638888888888888 | 114.716 |
| 0.7645833333333334 | 114.716 |
| 0.7652777777777778 | 110.201 |
| 0.7659722222222222 | 105.69 |
| 0.7666666666666666 | 96.682 |
| 0.7673611111111112 | 96.682 |
| 0.7680555555555556 | 96.682 |
| 0.7687499999999999 | 92.184 |
| 0.7694444444444444 | 87.692 |
| 0.7701388888888889 | 87.692 |
| 0.7708333333333334 | 78.722 |
| 0.7715277777777777 | 78.722 |
| 0.7722222222222223 | 83.205 |
| 0.7729166666666667 | 83.205 |
| 0.7736111111111111 | 78.722 |
| 0.7743055555555555 | 74.246 |
| 0.775 | 65.31 |
| 0.7756944444444445 | 65.31 |
| 0.7763888888888889 | 60.85 |
| 0.7770833333333332 | 56.398 |
| 0.7777777777777778 | 56.398 |
| 0.7784722222222222 | 56.398 |
| 0.7791666666666667 | 56.398 |
| 0.779861111111111 | 56.398 |
| 0.7805555555555556 | 56.398 |
| 0.78125 | 51.951 |
| 0.7819444444444444 | 51.951 |
| 0.782638888888889 | 51.951 |
| 0.7833333333333333 | 51.951 |
| 0.7840277777777778 | 51.951 |
| 0.7847222222222222 | 51.951 |
| 0.7854166666666668 | 51.951 |
| 0.7861111111111111 | 51.951 |
| 0.7868055555555555 | 51.951 |
| 0.7875 | 51.951 |
| 0.7881944444444445 | 47.511 |
| 0.7888888888888889 | 47.511 |
| 0.7895833333333333 | 47.511 |
| 0.7902777777777777 | 47.511 |
| 0.7909722222222223 | 47.511 |
| 0.7916666666666666 | 47.511 |
| 0.7923611111111111 | 47.511 |
| 0.7930555555555556 | 47.511 |
| 0.7937500000000001 | 47.511 |
| 0.7944444444444444 | 47.511 |
| 0.7951388888888888 | 47.511 |
| 0.7958333333333334 | 47.511 |
| 0.7965277777777778 | 47.511 |
| 0.7972222222222222 | 47.511 |
| 0.7979166666666666 | 47.511 |
| 0.7986111111111112 | 47.511 |
| 0.7993055555555556 | 43.079 |
| 0.7999999999999999 | 43.079 |
| 0.8006944444444444 | 38.653 |
| 0.8013888888888889 | 38.653 |
| 0.8020833333333334 | 38.653 |
| 0.8027777777777777 | 38.653 |
| 0.8034722222222223 | 38.653 |
| 0.8041666666666667 | 34.234 |
| 0.8048611111111111 | 34.234 |
| 0.8055555555555555 | 34.234 |
| 0.80625 | 29.823 |
| 0.8069444444444445 | 29.823 |
| 0.8076388888888889 | 29.823 |
| 0.8083333333333332 | 29.823 |
| 0.8090277777777778 | 29.823 |
| 0.8097222222222222 | 25.419 |
| 0.8104166666666667 | 25.419 |
| 0.811111111111111 | 25.419 |
| 0.8118055555555556 | 21.024 |
| 0.8125 | 21.024 |
| 0.8131944444444444 | 21.024 |
| 0.813888888888889 | 21.024 |
| 0.8145833333333333 | 16.636 |
| 0.8152777777777778 | 16.636 |
| 0.8159722222222222 | 12.257 |
| 0.8166666666666668 | 12.257 |
| 0.8173611111111111 | 12.257 |
| 0.8180555555555555 | 12.257 |
| 0.81875 | 7.887 |
| 0.8194444444444445 | 7.887 |
| 0.8201388888888889 | 7.887 |
| 0.8208333333333333 | 7.887 |
| 0.8215277777777777 | 3.525 |
| 0.8222222222222223 | 3.525 |
| 0.8229166666666666 | 3.525 |
| 0.8236111111111111 | 3.525 |
| 0.8243055555555556 | 3.525 |
| 0.8250000000000001 | 3.525 |
| 0.8256944444444444 | 3.525 |
| 0.8263888888888888 | 0 |
| 0.8270833333333334 | 0 |
| 0.8277777777777778 | 0 |
| 0.8284722222222222 | 0 |
| 0.8291666666666666 | 0 |
| 0.8298611111111112 | 0 |
| 0.8305555555555556 | 0 |
| 0.8312499999999999 | 0 |
| 0.8319444444444444 | 0 |
| 0.8326388888888889 | 0 |
| 0.8333333333333334 | 0 |
| 0.8340277777777777 | 0 |
| 0.8347222222222223 | 0 |
| 0.8354166666666667 | 0 |
| 0.8361111111111111 | 0 |
| 0.8368055555555555 | 0 |
| 0.8375 | 0 |
| 0.8381944444444445 | 0 |
| 0.8388888888888889 | 0 |
| 0.8395833333333332 | 0 |
| 0.8402777777777778 | 0 |
| 0.8409722222222222 | 0 |
| 0.8416666666666667 | 0 |
| 0.842361111111111 | 0 |
| 0.8430555555555556 | 0 |
| 0.84375 | 0 |
| 0.8444444444444444 | 0 |
| 0.845138888888889 | 0 |
| 0.8458333333333333 | 0 |
| 0.8465277777777778 | 0 |
| 0.8472222222222222 | 0 |
| 0.8479166666666668 | 0 |
| 0.8486111111111111 | 0 |
| 0.8493055555555555 | 0 |
| 0.85 | 0 |
| 0.8506944444444445 | 0 |
| 0.8513888888888889 | 0 |
| 0.8520833333333333 | 0 |
| 0.8527777777777777 | 0 |
| 0.8534722222222223 | 0 |
| 0.8541666666666666 | 0 |
| 0.8548611111111111 | 0 |
| 0.8555555555555556 | 0 |
| 0.8562500000000001 | 0 |
| 0.8569444444444444 | 0 |
| 0.8576388888888888 | 0 |
| 0.8583333333333334 | 0 |
| 0.8590277777777778 | 0 |
| 0.8597222222222222 | 0 |
| 0.8604166666666666 | 0 |
| 0.8611111111111112 | 0 |
| 0.8618055555555556 | 0 |
| 0.8624999999999999 | 0 |
| 0.8631944444444444 | 0 |
| 0.8638888888888889 | 0 |
| 0.8645833333333334 | 0 |
| 0.8652777777777777 | 0 |
| 0.8659722222222223 | 0 |
| 0.8666666666666667 | 0 |
| 0.8673611111111111 | 0 |
| 0.8680555555555555 | 0 |
| 0.86875 | 0 |
| 0.8694444444444445 | 0 |
| 0.8701388888888889 | 0 |
| 0.8708333333333332 | 0 |
| 0.8715277777777778 | 0 |
| 0.8722222222222222 | 0 |
| 0.8729166666666667 | 0 |
| 0.873611111111111 | 0 |
| 0.8743055555555556 | 0 |
| 0.875 | 0 |
| 0.8756944444444444 | 0 |
| 0.876388888888889 | 0 |
| 0.8770833333333333 | 0 |
| 0.8777777777777778 | 0 |
| 0.8784722222222222 | 0 |
| 0.8791666666666668 | 0 |
| 0.8798611111111111 | 0 |
| 0.8805555555555555 | 0 |
| 0.88125 | 0 |
| 0.8819444444444445 | 0 |
| 0.8826388888888889 | 0 |
| 0.8833333333333333 | 0 |
| 0.8840277777777777 | 0 |
| 0.8847222222222223 | 0 |
| 0.8854166666666666 | 0 |
| 0.8861111111111111 | 0 |
| 0.8868055555555556 | 0 |
| 0.8875000000000001 | 0 |
| 0.8881944444444444 | 0 |
| 0.8888888888888888 | 0 |
| 0.8895833333333334 | 0 |
| 0.8902777777777778 | 0 |
| 0.8909722222222222 | 0 |
| 0.8916666666666666 | 0 |
| 0.8923611111111112 | 0 |
| 0.8930555555555556 | 0 |
| 0.8937499999999999 | 0 |
| 0.8944444444444444 | 0 |
| 0.8951388888888889 | 0 |
| 0.8958333333333334 | 0 |
| 0.8965277777777777 | 0 |
| 0.8972222222222223 | 0 |
| 0.8979166666666667 | 0 |
| 0.8986111111111111 | 0 |
| 0.8993055555555555 | 0 |
| 0.9 | 0 |
| 0.9006944444444445 | 0 |
| 0.9013888888888889 | 0 |
| 0.9020833333333332 | 0 |
| 0.9027777777777778 | 0 |
| 0.9034722222222222 | 0 |
| 0.9041666666666667 | 0 |
| 0.904861111111111 | 0 |
| 0.9055555555555556 | 0 |
| 0.90625 | 0 |
| 0.9069444444444444 | 0 |
| 0.907638888888889 | 0 |
| 0.9083333333333333 | 0 |
| 0.9090277777777778 | 0 |
| 0.9097222222222222 | 0 |
| 0.9104166666666668 | 0 |
| 0.9111111111111111 | 0 |
| 0.9118055555555555 | 0 |
| 0.9125 | 0 |
| 0.9131944444444445 | 0 |
| 0.9138888888888889 | 0 |
| 0.9145833333333333 | 0 |
| 0.9152777777777777 | 0 |
| 0.9159722222222223 | 0 |
| 0.9166666666666666 | 0 |
| 0.9173611111111111 | 0 |
| 0.9180555555555556 | 0 |
| 0.9187500000000001 | 0 |
| 0.9194444444444444 | 0 |
| 0.9201388888888888 | 0 |
| 0.9208333333333334 | 0 |
| 0.9215277777777778 | 0 |
| 0.9222222222222222 | 0 |
| 0.9229166666666666 | 0 |
| 0.9236111111111112 | 0 |
| 0.9243055555555556 | 0 |
| 0.9249999999999999 | 0 |
| 0.9256944444444444 | 0 |
| 0.9263888888888889 | 0 |
| 0.9270833333333334 | 0 |
| 0.9277777777777777 | 0 |
| 0.9284722222222223 | 0 |
| 0.9291666666666667 | 0 |
| 0.9298611111111111 | 0 |
| 0.9305555555555555 | 0 |
| 0.93125 | 0 |
| 0.9319444444444445 | 0 |
| 0.9326388888888889 | 0 |
| 0.9333333333333332 | 0 |
| 0.9340277777777778 | 0 |
| 0.9347222222222222 | 0 |
| 0.9354166666666667 | 0 |
| 0.936111111111111 | 0 |
| 0.9368055555555556 | 0 |
| 0.9375 | 0 |
| 0.9381944444444444 | 0 |
| 0.938888888888889 | 0 |
| 0.9395833333333333 | 0 |
| 0.9402777777777778 | 0 |
| 0.9409722222222222 | 0 |
| 0.9416666666666668 | 0 |
| 0.9423611111111111 | 0 |
| 0.9430555555555555 | 0 |
| 0.94375 | 0 |
| 0.9444444444444445 | 0 |
| 0.9451388888888889 | 0 |
| 0.9458333333333333 | 0 |
| 0.9465277777777777 | 0 |
| 0.9472222222222223 | 0 |
| 0.9479166666666666 | 0 |
| 0.9486111111111111 | 0 |
| 0.9493055555555556 | 0 |
| 0.9500000000000001 | 0 |
| 0.9506944444444444 | 0 |
| 0.9513888888888888 | 0 |
| 0.9520833333333334 | 0 |
| 0.9527777777777778 | 0 |
| 0.9534722222222222 | 0 |
| 0.9541666666666666 | 0 |
| 0.9548611111111112 | 0 |
| 0.9555555555555556 | 0 |
| 0.9562499999999999 | 0 |
| 0.9569444444444444 | 0 |
| 0.9576388888888889 | 0 |
| 0.9583333333333334 | 0 |
| 0.9590277777777777 | 0 |
| 0.9597222222222223 | 0 |
| 0.9604166666666667 | 0 |
| 0.9611111111111111 | 0 |
| 0.9618055555555555 | 0 |
| 0.9625 | 0 |
| 0.9631944444444445 | 0 |
| 0.9638888888888889 | 0 |
| 0.9645833333333332 | 0 |
| 0.9652777777777778 | 0 |
| 0.9659722222222222 | 0 |
| 0.9666666666666667 | 0 |
| 0.967361111111111 | 0 |
| 0.9680555555555556 | 0 |
| 0.96875 | 0 |
| 0.9694444444444444 | 0 |
| 0.970138888888889 | 0 |
| 0.9708333333333333 | 0 |
| 0.9715277777777778 | 0 |
| 0.9722222222222222 | 0 |
| 0.9729166666666668 | 0 |
| 0.9736111111111111 | 0 |
| 0.9743055555555555 | 0 |
| 0.975 | 0 |
| 0.9756944444444445 | 0 |
| 0.9763888888888889 | 0 |
| 0.9770833333333333 | 0 |
| 0.9777777777777777 | 0 |
| 0.9784722222222223 | 0 |
| 0.9791666666666666 | 0 |
| 0.9798611111111111 | 0 |
| 0.9805555555555556 | 0 |
| 0.9812500000000001 | 0 |
| 0.9819444444444444 | 0 |
| 0.9826388888888888 | 0 |
| 0.9833333333333334 | 0 |
| 0.9840277777777778 | 0 |
| 0.9847222222222222 | 0 |
| 0.9854166666666666 | 0 |
| 0.9861111111111112 | 0 |
| 0.9868055555555556 | 0 |
| 0.9874999999999999 | 0 |
| 0.9881944444444444 | 0 |
| 0.9888888888888889 | 0 |
| 0.9895833333333334 | 0 |
| 0.9902777777777777 | 0 |
| 0.9909722222222223 | 0 |
| 0.9916666666666667 | 0 |
| 0.9923611111111111 | 0 |
| 0.9930555555555555 | 0 |
| 0.99375 | 0 |
| 0.9944444444444445 | 0 |
| 0.9951388888888889 | 0 |
| 0.9958333333333332 | 0 |
| 0.9965277777777778 | 0 |
| 0.9972222222222222 | 0 |
| 0.9979166666666667 | 0 |
| 0.998611111111111 | 0 |
| 0.9993055555555556 | 0 |